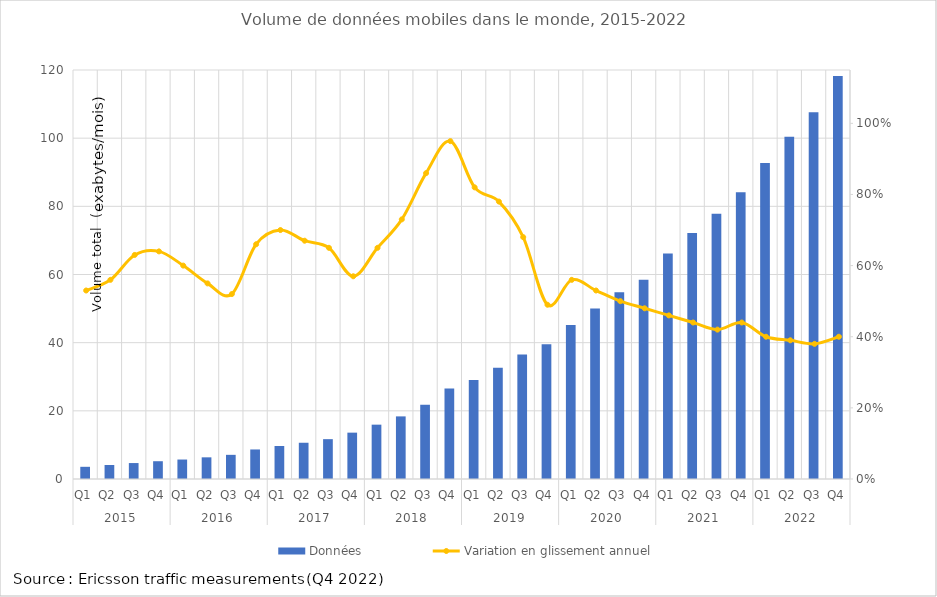
| Category | Données |
|---|---|
| 0 | 3.577 |
| 1 | 4.107 |
| 2 | 4.678 |
| 3 | 5.217 |
| 4 | 5.712 |
| 5 | 6.358 |
| 6 | 7.089 |
| 7 | 8.667 |
| 8 | 9.682 |
| 9 | 10.634 |
| 10 | 11.691 |
| 11 | 13.599 |
| 12 | 15.944 |
| 13 | 18.37 |
| 14 | 21.783 |
| 15 | 26.538 |
| 16 | 29.021 |
| 17 | 32.661 |
| 18 | 36.493 |
| 19 | 39.559 |
| 20 | 45.164 |
| 21 | 50.025 |
| 22 | 54.794 |
| 23 | 58.442 |
| 24 | 66.138 |
| 25 | 72.2 |
| 26 | 77.81 |
| 27 | 84.162 |
| 28 | 92.746 |
| 29 | 100.42 |
| 30 | 107.58 |
| 31 | 118.214 |